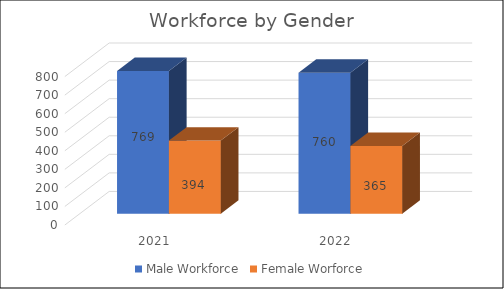
| Category | Male Workforce | Female Worforce |
|---|---|---|
| 2021.0 | 769 | 394 |
| 2022.0 | 760 | 365 |